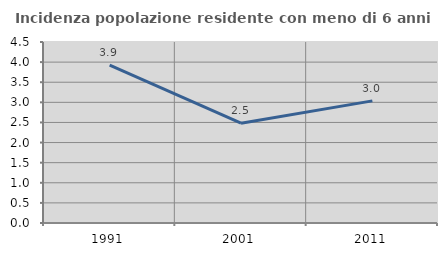
| Category | Incidenza popolazione residente con meno di 6 anni |
|---|---|
| 1991.0 | 3.925 |
| 2001.0 | 2.481 |
| 2011.0 | 3.036 |